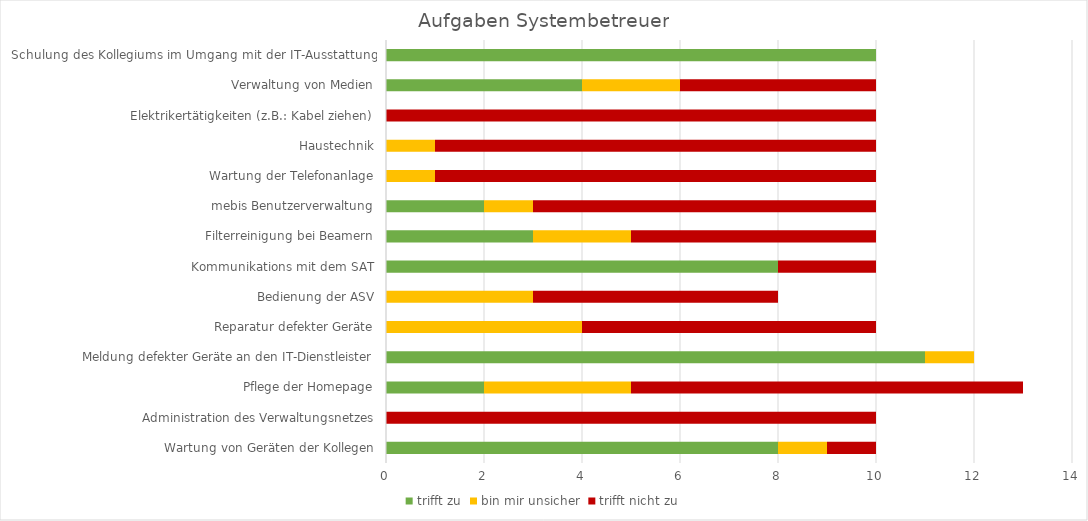
| Category | trifft zu | bin mir unsicher | trifft nicht zu |
|---|---|---|---|
| Wartung von Geräten der Kollegen | 8 | 1 | 1 |
| Administration des Verwaltungsnetzes | 0 | 0 | 10 |
| Pflege der Homepage | 2 | 3 | 8 |
| Meldung defekter Geräte an den IT-Dienstleister | 11 | 1 | 0 |
| Reparatur defekter Geräte | 0 | 4 | 6 |
| Bedienung der ASV | 0 | 3 | 5 |
| Kommunikations mit dem SAT | 8 | 0 | 2 |
| Filterreinigung bei Beamern | 3 | 2 | 5 |
| mebis Benutzerverwaltung | 2 | 1 | 7 |
| Wartung der Telefonanlage | 0 | 1 | 9 |
| Haustechnik | 0 | 1 | 9 |
| Elektrikertätigkeiten (z.B.: Kabel ziehen) | 0 | 0 | 10 |
| Verwaltung von Medien | 4 | 2 | 4 |
| Schulung des Kollegiums im Umgang mit der IT-Ausstattung | 10 | 0 | 0 |